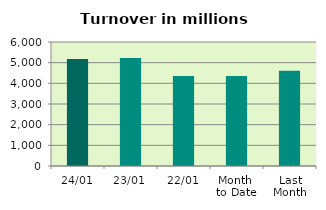
| Category | Series 0 |
|---|---|
| 24/01 | 5176.996 |
| 23/01 | 5228.409 |
| 22/01 | 4351.804 |
| Month 
to Date | 4349.699 |
| Last
Month | 4613.793 |